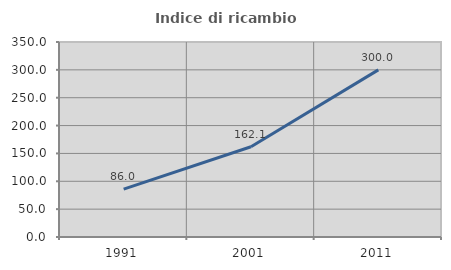
| Category | Indice di ricambio occupazionale  |
|---|---|
| 1991.0 | 85.965 |
| 2001.0 | 162.069 |
| 2011.0 | 300 |